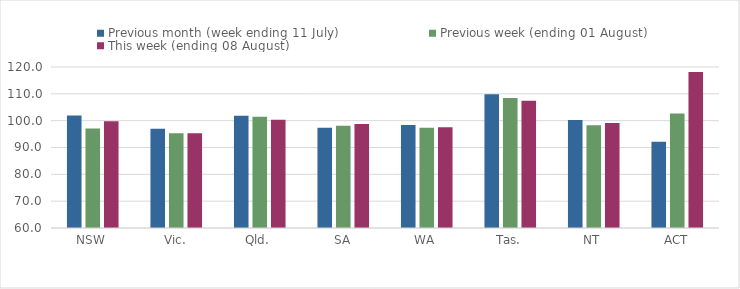
| Category | Previous month (week ending 11 July) | Previous week (ending 01 August) | This week (ending 08 August) |
|---|---|---|---|
| NSW | 101.953 | 97.098 | 99.752 |
| Vic. | 96.999 | 95.268 | 95.29 |
| Qld. | 101.805 | 101.469 | 100.387 |
| SA | 97.365 | 98.094 | 98.741 |
| WA | 98.428 | 97.38 | 97.57 |
| Tas. | 109.859 | 108.451 | 107.387 |
| NT | 100.216 | 98.272 | 99.136 |
| ACT | 92.105 | 102.632 | 118.105 |